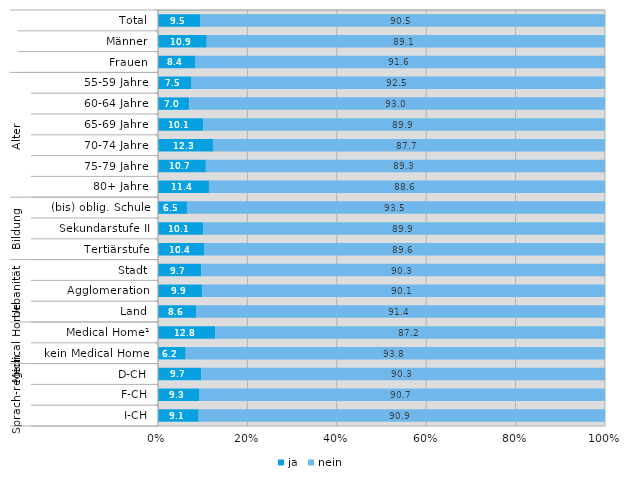
| Category | ja | nein |
|---|---|---|
| 0 | 9.5 | 90.5 |
| 1 | 10.9 | 89.1 |
| 2 | 8.4 | 91.6 |
| 3 | 7.5 | 92.5 |
| 4 | 7 | 93 |
| 5 | 10.1 | 89.9 |
| 6 | 12.3 | 87.7 |
| 7 | 10.7 | 89.3 |
| 8 | 11.4 | 88.6 |
| 9 | 6.5 | 93.5 |
| 10 | 10.1 | 89.9 |
| 11 | 10.4 | 89.6 |
| 12 | 9.7 | 90.3 |
| 13 | 9.9 | 90.1 |
| 14 | 8.6 | 91.4 |
| 15 | 12.8 | 87.2 |
| 16 | 6.2 | 93.8 |
| 17 | 9.7 | 90.3 |
| 18 | 9.3 | 90.7 |
| 19 | 9.1 | 90.9 |